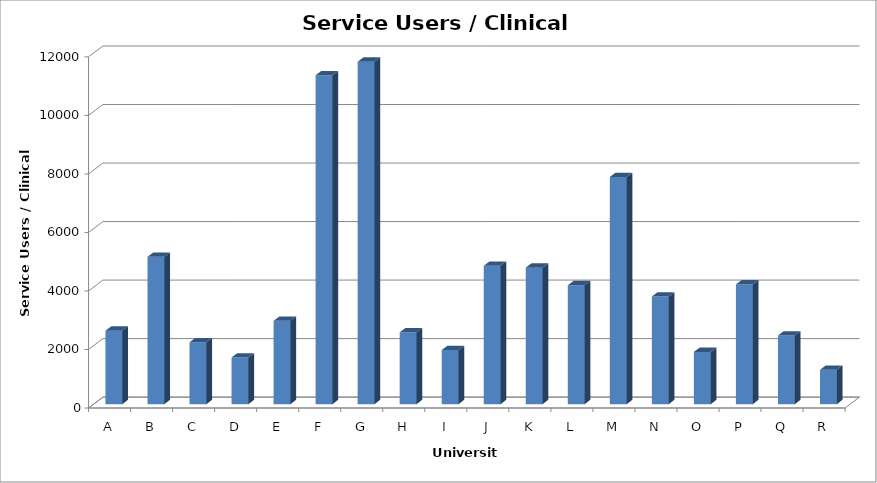
| Category | Service Users / Clinical FTE |
|---|---|
| A | 2511.111 |
| B | 5035.294 |
| C | 2115.023 |
| D | 1595.082 |
| E | 2847.222 |
| F | 11241.081 |
| G | 11703.636 |
| H | 2454.545 |
| I | 1850 |
| J | 4730 |
| K | 4666.731 |
| L | 4065.517 |
| M | 7764.706 |
| N | 3680 |
| O | 1786 |
| P | 4093.75 |
| Q | 2346.154 |
| R | 1176 |